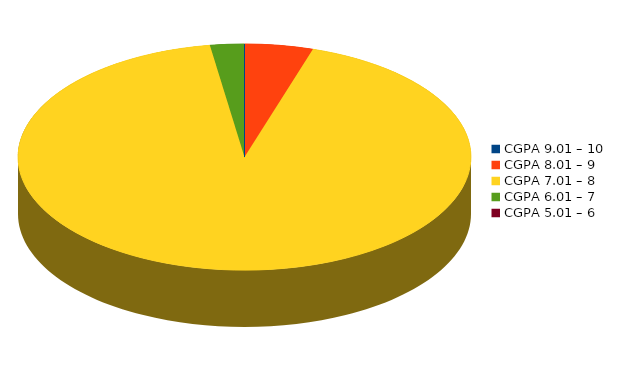
| Category | Number of students |
|---|---|
| CGPA 9.01 – 10 | 0 |
| CGPA 8.01 – 9 | 2 |
| CGPA 7.01 – 8 | 38 |
| CGPA 6.01 – 7 | 1 |
| CGPA 5.01 – 6 | 0 |